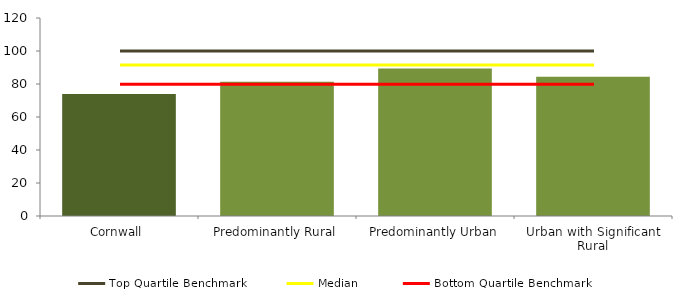
| Category | Series 0 |
|---|---|
| Cornwall | 73.913 |
| Predominantly Rural | 81.368 |
| Predominantly Urban | 89.368 |
| Urban with Significant Rural | 84.453 |